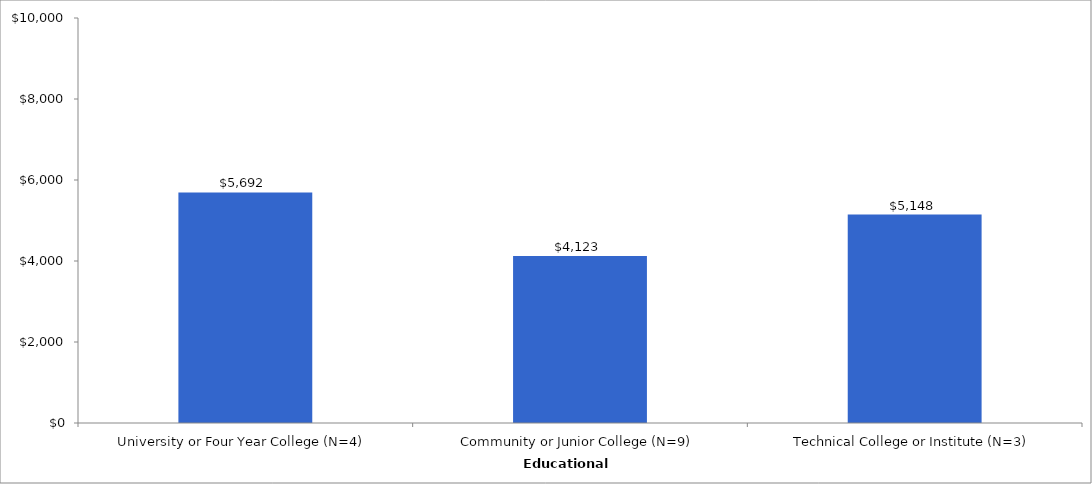
| Category | Series 0 |
|---|---|
| University or Four Year College (N=4) | 5692 |
| Community or Junior College (N=9) | 4123 |
| Technical College or Institute (N=3) | 5148 |